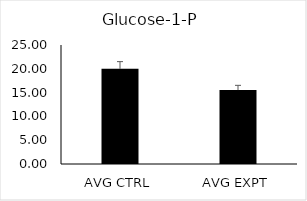
| Category | Series 0 |
|---|---|
| AVG CTRL | 19.985 |
| AVG EXPT | 15.536 |